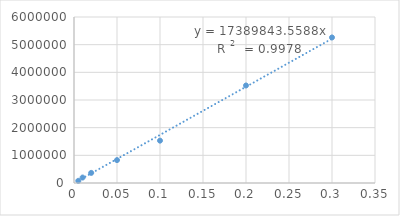
| Category | Series 0 |
|---|---|
| 0.3 | 5260521 |
| 0.2 | 3524574 |
| 0.1 | 1530688 |
| 0.05 | 827364 |
| 0.02 | 365408 |
| 0.01 | 197435 |
| 0.005 | 78353 |